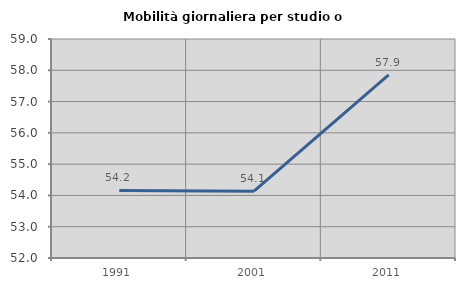
| Category | Mobilità giornaliera per studio o lavoro |
|---|---|
| 1991.0 | 54.159 |
| 2001.0 | 54.137 |
| 2011.0 | 57.856 |